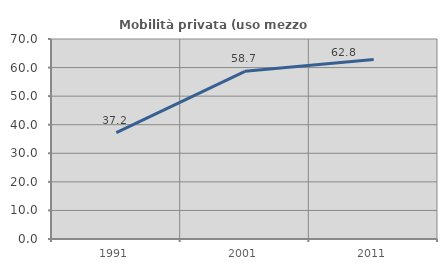
| Category | Mobilità privata (uso mezzo privato) |
|---|---|
| 1991.0 | 37.212 |
| 2001.0 | 58.687 |
| 2011.0 | 62.832 |